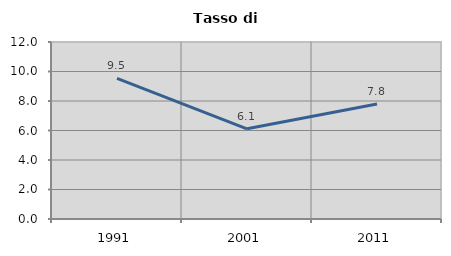
| Category | Tasso di disoccupazione   |
|---|---|
| 1991.0 | 9.531 |
| 2001.0 | 6.116 |
| 2011.0 | 7.794 |